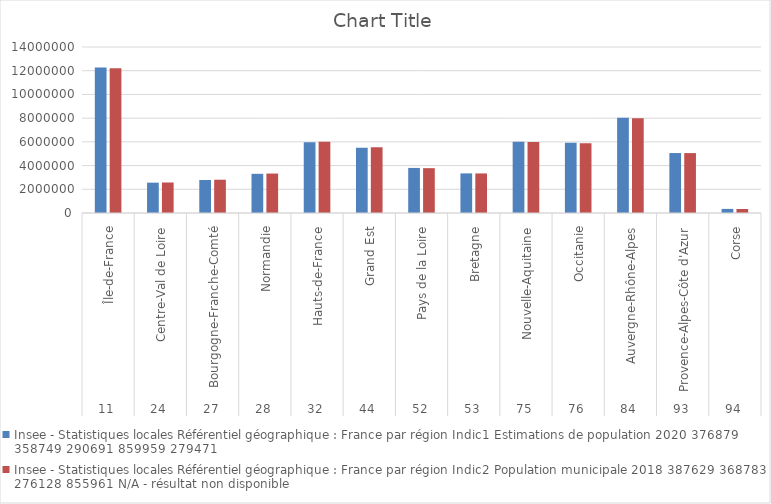
| Category | Insee - Statistiques locales |
|---|---|
| 0 | 12213447 |
| 1 | 2572853 |
| 2 | 2807807 |
| 3 | 3327477 |
| 4 | 6004108 |
| 5 | 5550389 |
| 6 | 3781423 |
| 7 | 3335414 |
| 8 | 5979778 |
| 9 | 5885496 |
| 10 | 7994459 |
| 11 | 5052832 |
| 12 | 338554 |